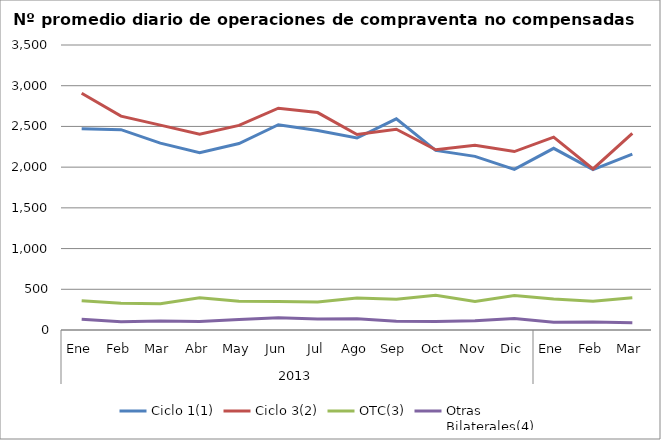
| Category | Ciclo 1(1) | Ciclo 3(2) | OTC(3) | Otras
Bilaterales(4) |
|---|---|---|---|---|
| 0 | 2472.091 | 2907.273 | 357.864 | 131.409 |
| 1 | 2459.8 | 2626.25 | 327.5 | 100.6 |
| 2 | 2294.6 | 2516 | 323.75 | 111.65 |
| 3 | 2176.182 | 2403.364 | 394.818 | 103.364 |
| 4 | 2290.048 | 2512.714 | 352.095 | 130.143 |
| 5 | 2520.75 | 2724.25 | 349.7 | 151.05 |
| 6 | 2449.045 | 2670.182 | 344.818 | 134.5 |
| 7 | 2357.333 | 2400.048 | 392.524 | 137.571 |
| 8 | 2593.778 | 2465 | 376.889 | 108.389 |
| 9 | 2205.955 | 2213.318 | 425.318 | 105.636 |
| 10 | 2132.1 | 2268.1 | 350 | 113.75 |
| 11 | 1972.35 | 2191.55 | 424.35 | 141.55 |
| 12 | 2231.227 | 2368.955 | 379.864 | 95 |
| 13 | 1969.85 | 1978.25 | 352.25 | 97.9 |
| 14 | 2160.619 | 2415.286 | 395.857 | 87.762 |